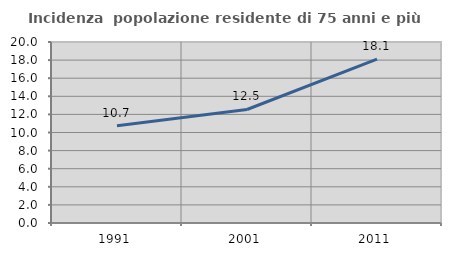
| Category | Incidenza  popolazione residente di 75 anni e più |
|---|---|
| 1991.0 | 10.74 |
| 2001.0 | 12.542 |
| 2011.0 | 18.101 |